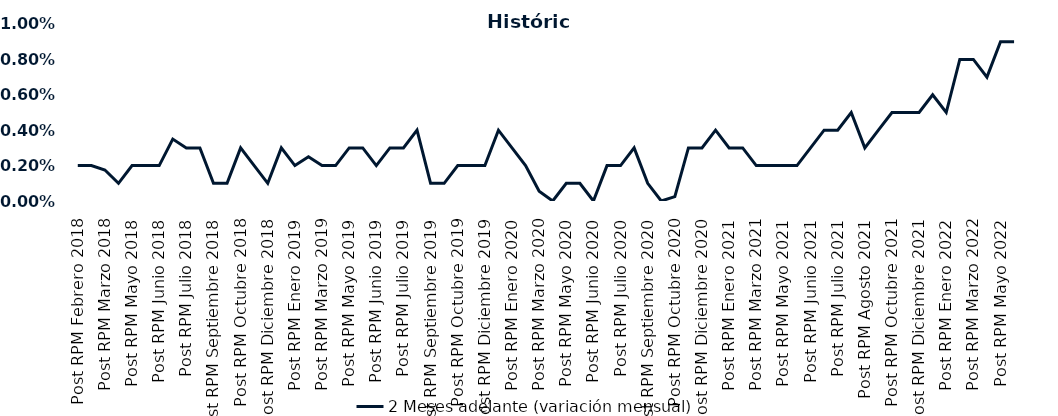
| Category | 2 Meses adelante (variación mensual) |
|---|---|
| Post RPM Febrero 2018 | 0.002 |
| Pre RPM Marzo 2018 | 0.002 |
| Post RPM Marzo 2018 | 0.002 |
| Pre RPM Mayo 2018 | 0.001 |
| Post RPM Mayo 2018 | 0.002 |
| Pre RPM Junio 2018 | 0.002 |
| Post RPM Junio 2018 | 0.002 |
| Pre RPM Julio 2018 | 0.004 |
| Post RPM Julio 2018 | 0.003 |
| Pre RPM Septiembre 2018 | 0.003 |
| Post RPM Septiembre 2018 | 0.001 |
| Pre RPM Octubre 2018 | 0.001 |
| Post RPM Octubre 2018 | 0.003 |
| Pre RPM Diciembre 2018 | 0.002 |
| Post RPM Diciembre 2018 | 0.001 |
| Pre RPM Enero 2019 | 0.003 |
| Post RPM Enero 2019 | 0.002 |
| Pre RPM Marzo 2019 | 0.002 |
| Post RPM Marzo 2019 | 0.002 |
| Pre RPM Mayo 2019 | 0.002 |
| Post RPM Mayo 2019 | 0.003 |
| Pre RPM Junio 2019 | 0.003 |
| Post RPM Junio 2019 | 0.002 |
| Pre RPM Julio 2019 | 0.003 |
| Post RPM Julio 2019 | 0.003 |
| Pre RPM Septiembre 2019 | 0.004 |
| Post RPM Septiembre 2019 | 0.001 |
| Pre RPM Octubre 2019 | 0.001 |
| Post RPM Octubre 2019 | 0.002 |
| Pre RPM Diciembre 2019 | 0.002 |
| Post RPM Diciembre 2019 | 0.002 |
| Pre RPM Enero 2020 | 0.004 |
| Post RPM Enero 2020 | 0.003 |
| Pre RPM Marzo 2020 | 0.002 |
| Post RPM Marzo 2020 | 0.001 |
| Pre RPM Mayo 2020 | 0 |
| Post RPM Mayo 2020 | 0.001 |
| Pre RPM Junio 2020 | 0.001 |
| Post RPM Junio 2020 | 0 |
| Pre RPM Julio 2020 | 0.002 |
| Post RPM Julio 2020 | 0.002 |
| Pre RPM Septiembre 2020 | 0.003 |
| Post RPM Septiembre 2020 | 0.001 |
| Pre RPM Octubre 2020 | 0 |
| Post RPM Octubre 2020 | 0 |
| Pre RPM Diciembre 2020 | 0.003 |
| Post RPM Diciembre 2020 | 0.003 |
| Pre RPM Enero 2021 | 0.004 |
| Post RPM Enero 2021 | 0.003 |
| Pre RPM Marzo 2021 | 0.003 |
| Post RPM Marzo 2021 | 0.002 |
| Pre RPM Mayo 2021 | 0.002 |
| Post RPM Mayo 2021 | 0.002 |
| Pre RPM Junio 2021 | 0.002 |
| Post RPM Junio 2021 | 0.003 |
| Pre RPM Julio 2021 | 0.004 |
| Post RPM Julio 2021 | 0.004 |
| Pre RPM Agosto 2021 | 0.005 |
| Post RPM Agosto 2021 | 0.003 |
| Pre RPM Octubre 2021 | 0.004 |
| Post RPM Octubre 2021 | 0.005 |
| Pre RPM Diciembre 2021 | 0.005 |
| Post RPM Diciembre 2021 | 0.005 |
| Pre RPM Enero 2022 | 0.006 |
| Post RPM Enero 2022 | 0.005 |
| Pre RPM Marzo 2022 | 0.008 |
| Post RPM Marzo 2022 | 0.008 |
| Pre RPM Mayo 2022 | 0.007 |
| Post RPM Mayo 2022 | 0.009 |
| Pre RPM Junio 2022 | 0.009 |